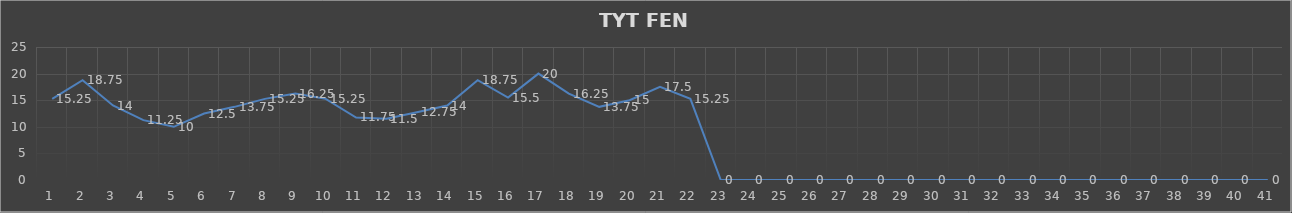
| Category | Series 0 |
|---|---|
| 0 | 15.25 |
| 1 | 18.75 |
| 2 | 14 |
| 3 | 11.25 |
| 4 | 10 |
| 5 | 12.5 |
| 6 | 13.75 |
| 7 | 15.25 |
| 8 | 16.25 |
| 9 | 15.25 |
| 10 | 11.75 |
| 11 | 11.5 |
| 12 | 12.75 |
| 13 | 14 |
| 14 | 18.75 |
| 15 | 15.5 |
| 16 | 20 |
| 17 | 16.25 |
| 18 | 13.75 |
| 19 | 15 |
| 20 | 17.5 |
| 21 | 15.25 |
| 22 | 0 |
| 23 | 0 |
| 24 | 0 |
| 25 | 0 |
| 26 | 0 |
| 27 | 0 |
| 28 | 0 |
| 29 | 0 |
| 30 | 0 |
| 31 | 0 |
| 32 | 0 |
| 33 | 0 |
| 34 | 0 |
| 35 | 0 |
| 36 | 0 |
| 37 | 0 |
| 38 | 0 |
| 39 | 0 |
| 40 | 0 |